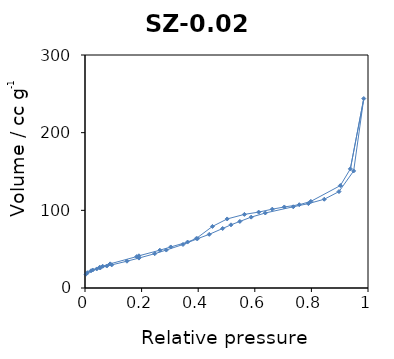
| Category | Series 0 |
|---|---|
| 0.003388 | 17.787 |
| 0.008883 | 19.685 |
| 0.021132 | 22.099 |
| 0.041433 | 24.516 |
| 0.053779 | 25.74 |
| 0.076943 | 28.306 |
| 0.094449 | 29.761 |
| 0.148248 | 34.499 |
| 0.190394 | 38.526 |
| 0.246363 | 44.16 |
| 0.287277 | 48.865 |
| 0.346268 | 56.019 |
| 0.39767 | 63.474 |
| 0.439002 | 69.082 |
| 0.486452 | 76.644 |
| 0.515795 | 81.344 |
| 0.547197 | 85.711 |
| 0.587193 | 91.242 |
| 0.636992 | 96.566 |
| 0.73595 | 104.577 |
| 0.789316 | 108.642 |
| 0.845463 | 114.286 |
| 0.897453 | 124.143 |
| 0.949329 | 150.717 |
| 0.985039 | 243.937 |
| 0.937649 | 153.355 |
| 0.902318 | 131.88 |
| 0.798099 | 111.526 |
| 0.75711 | 107.231 |
| 0.70425 | 104.342 |
| 0.661804 | 101.485 |
| 0.613619 | 97.721 |
| 0.563224 | 94.791 |
| 0.502414 | 88.913 |
| 0.450347 | 79.266 |
| 0.393409 | 63.801 |
| 0.362498 | 59.156 |
| 0.303102 | 52.847 |
| 0.264439 | 48.65 |
| 0.190638 | 41.462 |
| 0.182761 | 40.449 |
| 0.08894 | 31.088 |
| 0.08869 | 30.89 |
| 0.062511 | 28.021 |
| 0.052213 | 26.801 |
| 0.02734 | 23.177 |